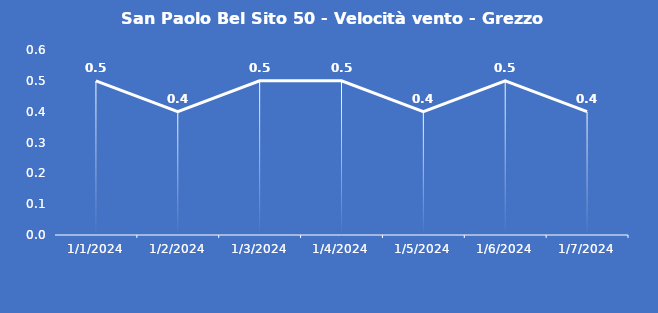
| Category | San Paolo Bel Sito 50 - Velocità vento - Grezzo (m/s) |
|---|---|
| 1/1/24 | 0.5 |
| 1/2/24 | 0.4 |
| 1/3/24 | 0.5 |
| 1/4/24 | 0.5 |
| 1/5/24 | 0.4 |
| 1/6/24 | 0.5 |
| 1/7/24 | 0.4 |